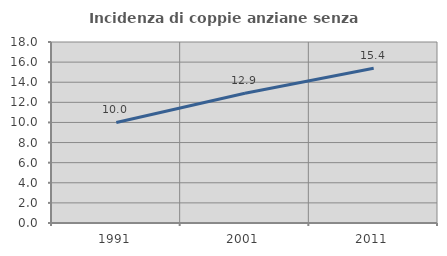
| Category | Incidenza di coppie anziane senza figli  |
|---|---|
| 1991.0 | 10 |
| 2001.0 | 12.897 |
| 2011.0 | 15.392 |